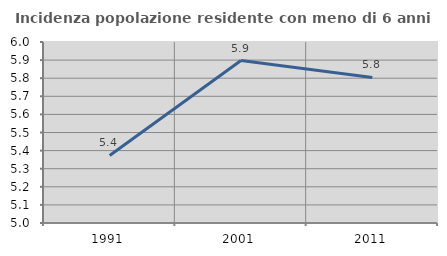
| Category | Incidenza popolazione residente con meno di 6 anni |
|---|---|
| 1991.0 | 5.373 |
| 2001.0 | 5.897 |
| 2011.0 | 5.804 |